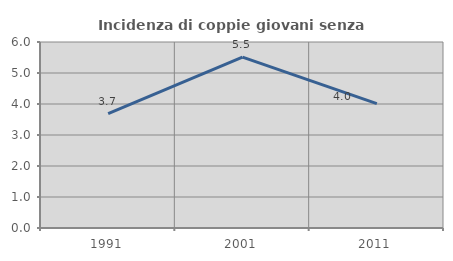
| Category | Incidenza di coppie giovani senza figli |
|---|---|
| 1991.0 | 3.689 |
| 2001.0 | 5.515 |
| 2011.0 | 4.013 |